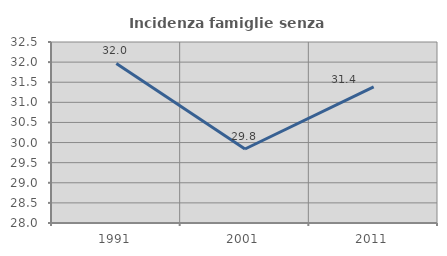
| Category | Incidenza famiglie senza nuclei |
|---|---|
| 1991.0 | 31.967 |
| 2001.0 | 29.84 |
| 2011.0 | 31.385 |